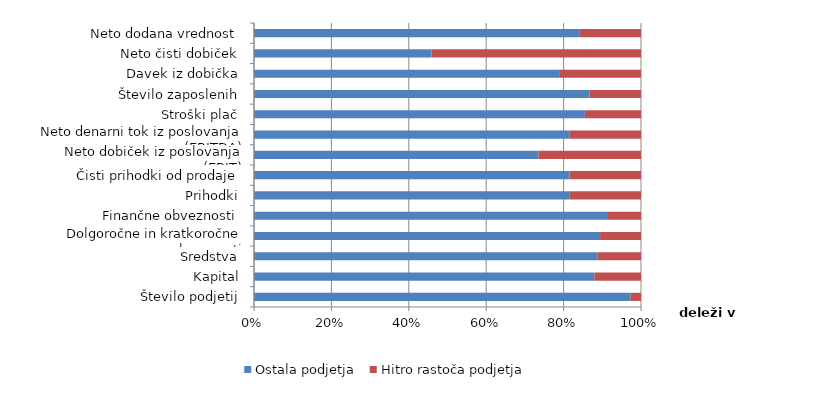
| Category | Ostala podjetja | Hitro rastoča podjetja |
|---|---|---|
| Število podjetij | 132619 | 3725 |
| Kapital | 39017260 | 5345394 |
| Sredstva | 99138049 | 12434951 |
| Dolgoročne in kratkoročne obveznosti | 59918172 | 7084849 |
| Finančne obveznosti | 37341427 | 3610150 |
| Prihodki | 81720645 | 18418757 |
| Čisti prihodki od prodaje | 79188320 | 17974208 |
| Neto dobiček iz poslovanja (EBIT) | 2382279 | 858784 |
| Neto denarni tok iz poslovanja (EBITDA) | 6783732 | 1529976 |
| Stroški plač | 7919147 | 1343107 |
| Število zaposlenih | 478450 | 73582 |
| Davek iz dobička | 365339 | 97924 |
| Neto čisti dobiček | 596816 | 703963 |
| Neto dodana vrednost | 17654975 | 3352680 |